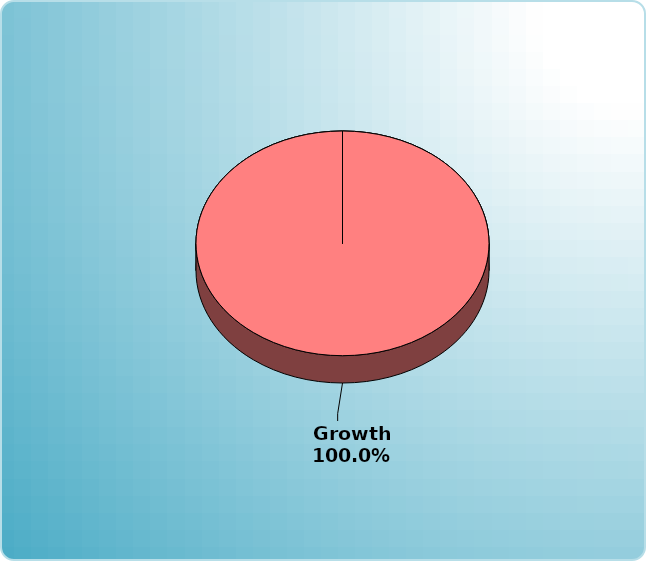
| Category | Series 0 |
|---|---|
| Cash | 0 |
| Bonds | 0 |
| Muni Bond | 0 |
| Hybrid bond | 0 |
| Value | 0 |
| Growth | 25000 |
| Small-Cap | 0 |
| Tangibles | 0 |
| International | 0 |
| Personal Property | 0 |
| Miscellaneous | 0 |